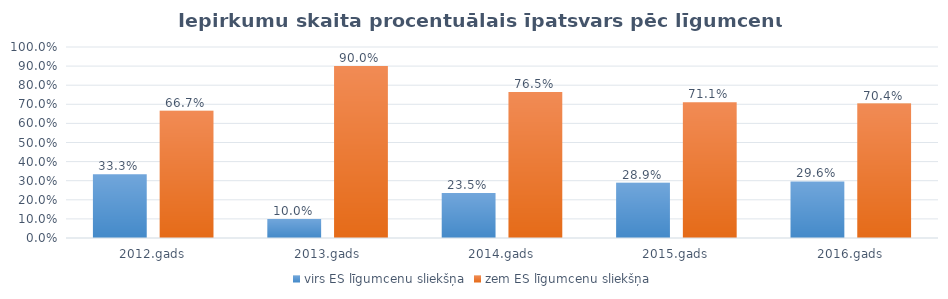
| Category | virs ES līgumcenu sliekšņa | zem ES līgumcenu sliekšņa |
|---|---|---|
| 2012.gads | 0.333 | 0.667 |
| 2013.gads | 0.1 | 0.9 |
| 2014.gads | 0.235 | 0.765 |
| 2015.gads | 0.289 | 0.711 |
| 2016.gads | 0.296 | 0.704 |